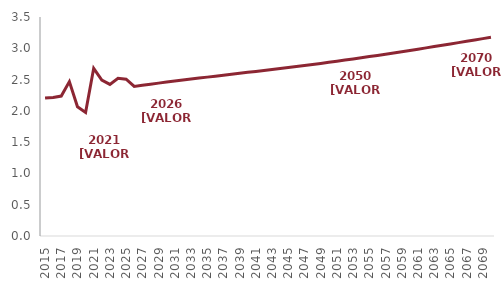
| Category | IS |
|---|---|
| 2015.0 | 2.204 |
| 2016.0 | 2.215 |
| 2017.0 | 2.237 |
| 2018.0 | 2.467 |
| 2019.0 | 2.065 |
| 2020.0 | 1.974 |
| 2021.0 | 2.68 |
| 2022.0 | 2.492 |
| 2023.0 | 2.423 |
| 2024.0 | 2.521 |
| 2025.0 | 2.505 |
| 2026.0 | 2.39 |
| 2027.0 | 2.408 |
| 2028.0 | 2.426 |
| 2029.0 | 2.443 |
| 2030.0 | 2.46 |
| 2031.0 | 2.476 |
| 2032.0 | 2.492 |
| 2033.0 | 2.508 |
| 2034.0 | 2.523 |
| 2035.0 | 2.539 |
| 2036.0 | 2.554 |
| 2037.0 | 2.57 |
| 2038.0 | 2.585 |
| 2039.0 | 2.6 |
| 2040.0 | 2.615 |
| 2041.0 | 2.631 |
| 2042.0 | 2.646 |
| 2043.0 | 2.661 |
| 2044.0 | 2.676 |
| 2045.0 | 2.692 |
| 2046.0 | 2.708 |
| 2047.0 | 2.724 |
| 2048.0 | 2.741 |
| 2049.0 | 2.758 |
| 2050.0 | 2.776 |
| 2051.0 | 2.794 |
| 2052.0 | 2.812 |
| 2053.0 | 2.83 |
| 2054.0 | 2.848 |
| 2055.0 | 2.867 |
| 2056.0 | 2.886 |
| 2057.0 | 2.906 |
| 2058.0 | 2.925 |
| 2059.0 | 2.945 |
| 2060.0 | 2.966 |
| 2061.0 | 2.986 |
| 2062.0 | 3.007 |
| 2063.0 | 3.027 |
| 2064.0 | 3.048 |
| 2065.0 | 3.07 |
| 2066.0 | 3.091 |
| 2067.0 | 3.112 |
| 2068.0 | 3.133 |
| 2069.0 | 3.155 |
| 2070.0 | 3.176 |